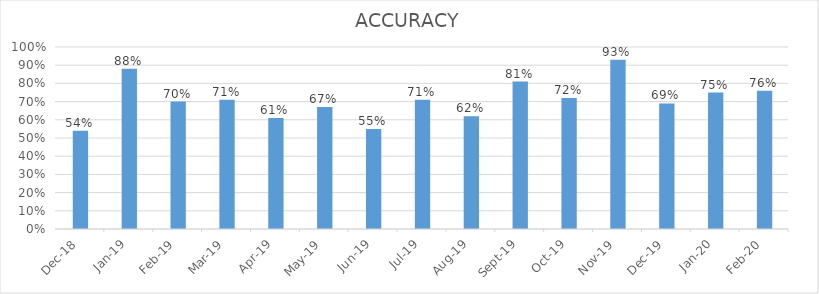
| Category | ACCURACY |
|---|---|
| 2020-02-01 | 0.76 |
| 2020-01-01 | 0.75 |
| 2019-12-01 | 0.69 |
| 2019-11-01 | 0.93 |
| 2019-10-01 | 0.72 |
| 2019-09-01 | 0.81 |
| 2019-08-01 | 0.62 |
| 2019-07-01 | 0.71 |
| 2019-06-01 | 0.55 |
| 2019-05-01 | 0.67 |
| 2019-04-01 | 0.61 |
| 2019-03-01 | 0.71 |
| 2019-02-01 | 0.7 |
| 2019-01-01 | 0.88 |
| 2018-12-01 | 0.54 |